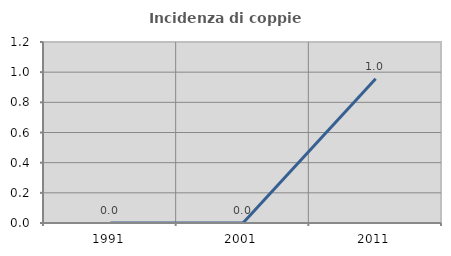
| Category | Incidenza di coppie miste |
|---|---|
| 1991.0 | 0 |
| 2001.0 | 0 |
| 2011.0 | 0.957 |